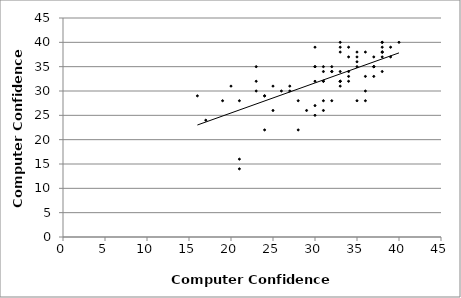
| Category | Series 0 |
|---|---|
| 32.0 | 35 |
| 38.0 | 40 |
| 23.0 | 30 |
| 31.0 | 34 |
| 32.0 | 34 |
| 34.0 | 37 |
| 29.0 | 26 |
| 31.0 | 32 |
| 37.0 | 35 |
| 39.0 | 37 |
| 33.0 | 32 |
| 32.0 | 28 |
| 30.0 | 35 |
| 30.0 | 27 |
| 34.0 | 34 |
| 21.0 | 28 |
| 30.0 | 25 |
| 33.0 | 38 |
| 23.0 | 35 |
| 36.0 | 38 |
| 25.0 | 31 |
| 39.0 | 39 |
| 38.0 | 38 |
| 31.0 | 26 |
| 34.0 | 39 |
| 35.0 | 35 |
| 24.0 | 29 |
| 31.0 | 32 |
| 35.0 | 38 |
| 19.0 | 28 |
| 37.0 | 33 |
| 32.0 | 34 |
| 33.0 | 31 |
| 26.0 | 30 |
| 20.0 | 31 |
| 25.0 | 26 |
| 33.0 | 32 |
| 27.0 | 31 |
| 30.0 | 35 |
| 36.0 | 28 |
| 24.0 | 22 |
| 38.0 | 38 |
| 16.0 | 29 |
| 38.0 | 39 |
| 36.0 | 30 |
| 40.0 | 40 |
| 35.0 | 36 |
| 24.0 | 29 |
| 33.0 | 34 |
| 33.0 | 32 |
| 37.0 | 35 |
| 38.0 | 37 |
| 33.0 | 40 |
| 38.0 | 38 |
| 17.0 | 24 |
| 34.0 | 33 |
| 37.0 | 37 |
| 38.0 | 34 |
| 38.0 | 40 |
| 34.0 | 32 |
| 33.0 | 39 |
| 35.0 | 37 |
| 30.0 | 39 |
| 27.0 | 30 |
| 28.0 | 28 |
| 21.0 | 16 |
| 37.0 | 35 |
| 23.0 | 32 |
| 31.0 | 28 |
| 30.0 | 32 |
| 28.0 | 22 |
| 36.0 | 33 |
| 35.0 | 28 |
| 31.0 | 35 |
| 21.0 | 14 |